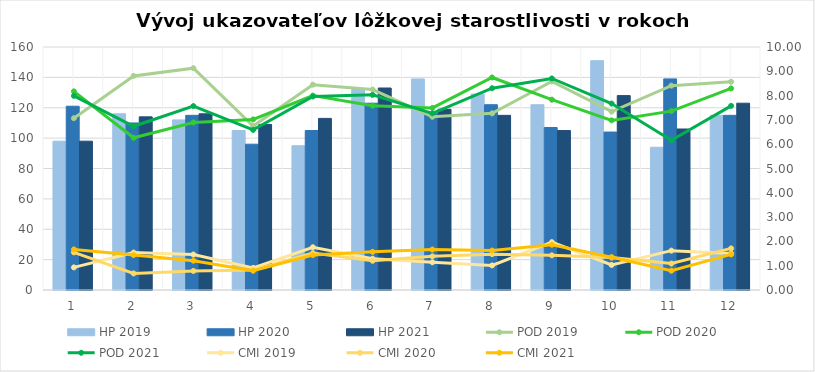
| Category | HP 2019 | HP 2020 | HP 2021 |
|---|---|---|---|
| 0 | 98 | 121 | 98 |
| 1 | 116 | 110 | 114 |
| 2 | 112 | 115 | 116 |
| 3 | 105 | 96 | 109 |
| 4 | 95 | 105 | 113 |
| 5 | 132 | 123 | 133 |
| 6 | 139 | 116 | 119 |
| 7 | 129 | 122 | 115 |
| 8 | 122 | 107 | 105 |
| 9 | 151 | 104 | 128 |
| 10 | 94 | 139 | 106 |
| 11 | 115 | 115 | 123 |